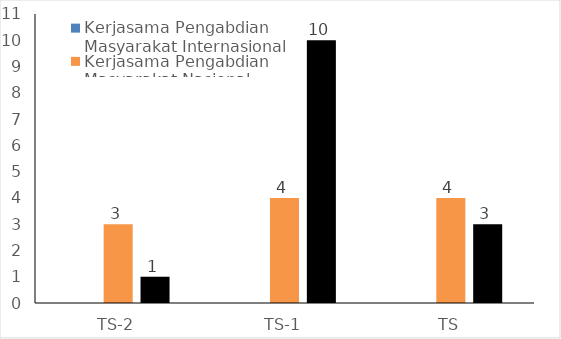
| Category | Kerjasama Pengabdian Masyarakat Internasional | Kerjasama Pengabdian Masyarakat Nasional | Kerjasama Pengabdian Masyarakat Lokal |
|---|---|---|---|
| TS-2 |  | 3 | 1 |
| TS-1 |  | 4 | 10 |
| TS |  | 4 | 3 |